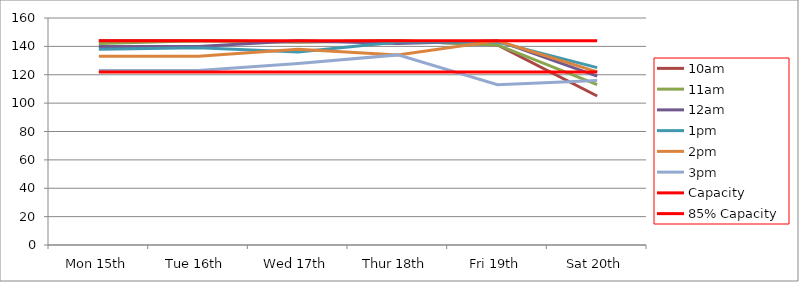
| Category | 9am | 10am | 11am | 12am | 1pm | 2pm | 3pm | 4pm | 5pm | Capacity | 85% Capacity |
|---|---|---|---|---|---|---|---|---|---|---|---|
| Mon 15th |  | 144 | 142 | 140 | 138 | 133 | 123 |  |  | 144 | 122 |
| Tue 16th |  | 144 | 144 | 140 | 139 | 133 | 123 |  |  | 144 | 122 |
| Wed 17th |  | 143 | 143 | 144 | 136 | 138 | 128 |  |  | 144 | 122 |
| Thur 18th |  | 144 | 144 | 142 | 143 | 134 | 134 |  |  | 144 | 122 |
| Fri 19th |  | 141 | 141 | 144 | 143 | 144 | 113 |  |  | 144 | 122 |
| Sat 20th |  | 105 | 113 | 119 | 125 | 122 | 116 |  |  | 144 | 122 |